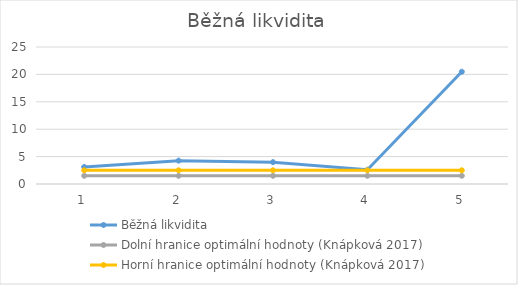
| Category | Běžná likvidita | Dolní hranice optimální hodnoty (Knápková 2017) | Horní hranice optimální hodnoty (Knápková 2017) |
|---|---|---|---|
| 0 | 3.108 | 1.5 | 2.5 |
| 1 | 4.264 | 1.5 | 2.5 |
| 2 | 3.989 | 1.5 | 2.5 |
| 3 | 2.605 | 1.5 | 2.5 |
| 4 | 20.483 | 1.5 | 2.5 |